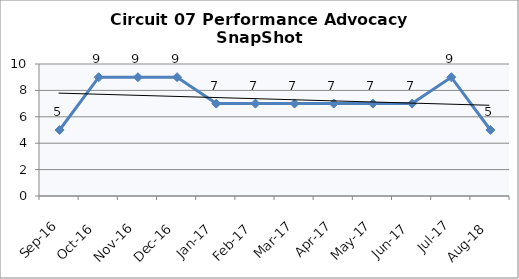
| Category | Circuit 07 |
|---|---|
| Sep-16 | 5 |
| Oct-16 | 9 |
| Nov-16 | 9 |
| Dec-16 | 9 |
| Jan-17 | 7 |
| Feb-17 | 7 |
| Mar-17 | 7 |
| Apr-17 | 7 |
| May-17 | 7 |
| Jun-17 | 7 |
| Jul-17 | 9 |
| Aug-18 | 5 |